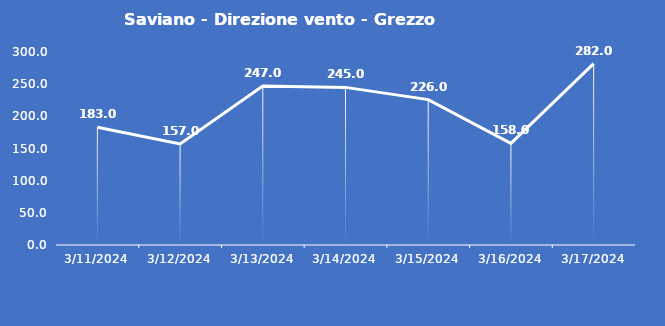
| Category | Saviano - Direzione vento - Grezzo (°N) |
|---|---|
| 3/11/24 | 183 |
| 3/12/24 | 157 |
| 3/13/24 | 247 |
| 3/14/24 | 245 |
| 3/15/24 | 226 |
| 3/16/24 | 158 |
| 3/17/24 | 282 |